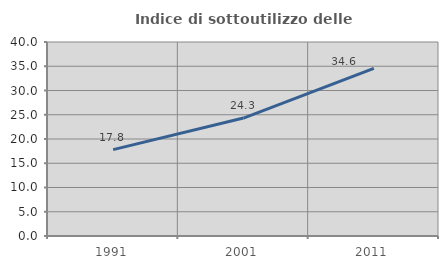
| Category | Indice di sottoutilizzo delle abitazioni  |
|---|---|
| 1991.0 | 17.808 |
| 2001.0 | 24.324 |
| 2011.0 | 34.568 |